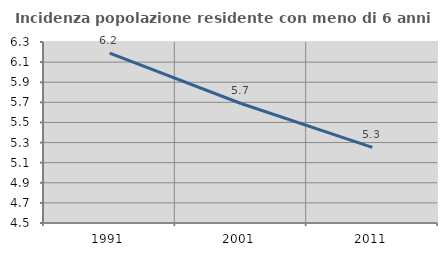
| Category | Incidenza popolazione residente con meno di 6 anni |
|---|---|
| 1991.0 | 6.189 |
| 2001.0 | 5.688 |
| 2011.0 | 5.253 |